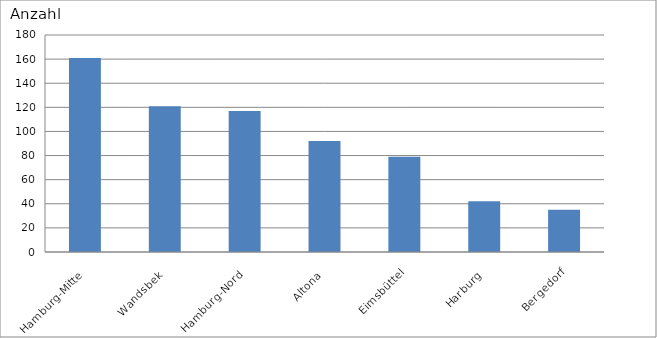
| Category | Hamburg-Mitte Wandsbek Hamburg-Nord Altona Eimsbüttel Harburg Bergedorf |
|---|---|
| Hamburg-Mitte | 161 |
| Wandsbek | 121 |
| Hamburg-Nord | 117 |
| Altona | 92 |
| Eimsbüttel | 79 |
| Harburg | 42 |
| Bergedorf | 35 |